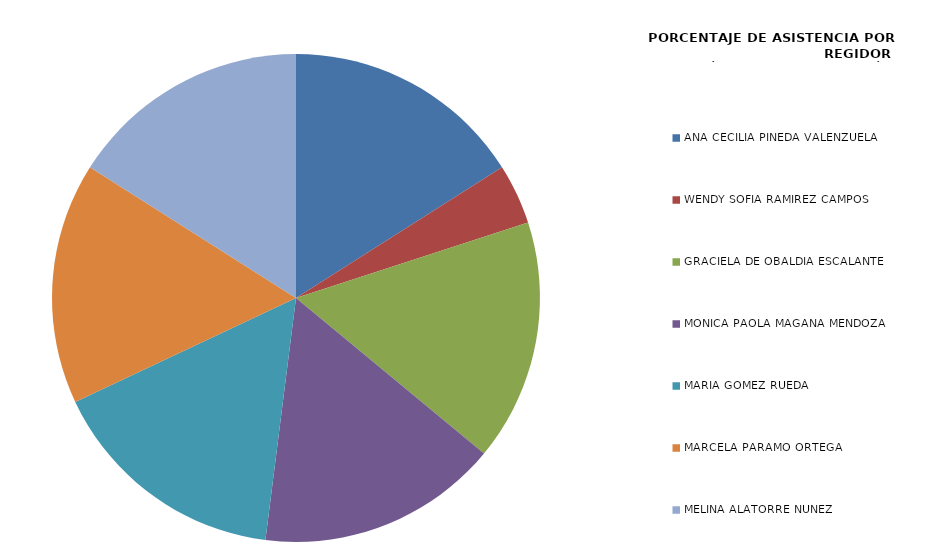
| Category | Series 0 |
|---|---|
| ANA CECILIA PINEDA VALENZUELA | 100 |
| WENDY SOFÍA RAMÍREZ CAMPOS | 25 |
| GRACIELA DE OBALDÍA ESCALANTE | 100 |
| MÓNICA PAOLA MAGAÑA MENDOZA | 100 |
| MARÍA GÓMEZ RUEDA | 100 |
| MARCELA PÁRAMO ORTEGA | 100 |
| MELINA ALATORRE NÚÑEZ | 100 |